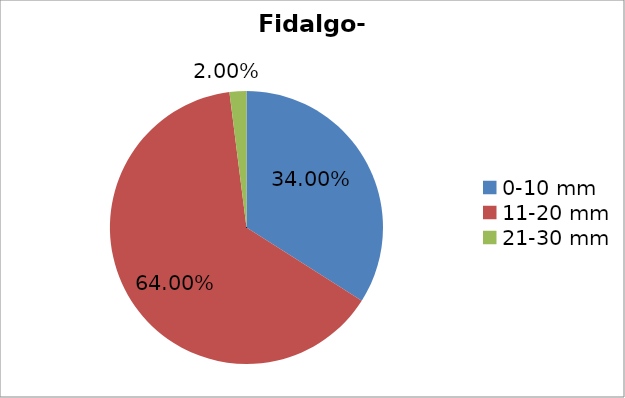
| Category | Series 0 |
|---|---|
| 0-10 mm | 0.34 |
| 11-20 mm | 0.64 |
| 21-30 mm | 0.02 |